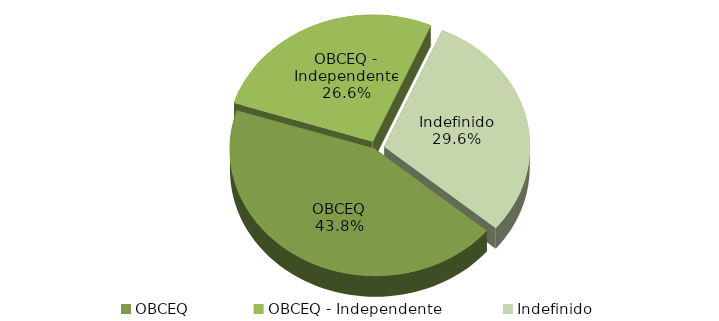
| Category | Series 0 |
|---|---|
| OBCEQ | 48537 |
| OBCEQ - Independente | 29505 |
| Indefinido | 32788 |